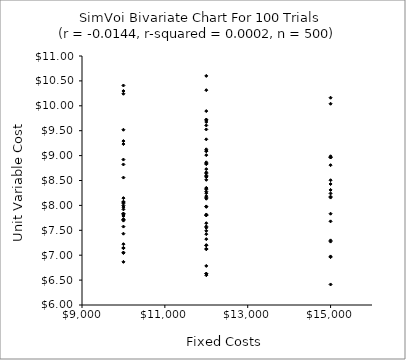
| Category | Series 0 |
|---|---|
| 12000.0 | 8.58 |
| 12000.0 | 8.323 |
| 12000.0 | 7.201 |
| 10000.0 | 7.811 |
| 12000.0 | 9.126 |
| 15000.0 | 6.412 |
| 10000.0 | 7.719 |
| 10000.0 | 8.559 |
| 10000.0 | 7.719 |
| 12000.0 | 8.134 |
| 12000.0 | 8.278 |
| 12000.0 | 8.843 |
| 12000.0 | 7.818 |
| 15000.0 | 8.176 |
| 12000.0 | 7.422 |
| 15000.0 | 6.961 |
| 10000.0 | 7.831 |
| 12000.0 | 9.713 |
| 12000.0 | 9.01 |
| 15000.0 | 8.429 |
| 12000.0 | 7.801 |
| 10000.0 | 8.075 |
| 10000.0 | 9.519 |
| 12000.0 | 7.97 |
| 15000.0 | 7.273 |
| 12000.0 | 7.489 |
| 12000.0 | 6.625 |
| 12000.0 | 7.129 |
| 12000.0 | 8.866 |
| 12000.0 | 9.525 |
| 10000.0 | 7.147 |
| 12000.0 | 9.606 |
| 10000.0 | 10.241 |
| 15000.0 | 10.162 |
| 15000.0 | 8.986 |
| 10000.0 | 10.408 |
| 12000.0 | 7.801 |
| 12000.0 | 6.784 |
| 12000.0 | 10.6 |
| 12000.0 | 8.643 |
| 15000.0 | 8.808 |
| 12000.0 | 8.6 |
| 15000.0 | 6.975 |
| 12000.0 | 9.087 |
| 12000.0 | 7.578 |
| 12000.0 | 7.551 |
| 10000.0 | 7.837 |
| 12000.0 | 9.327 |
| 10000.0 | 7.575 |
| 12000.0 | 7.322 |
| 10000.0 | 8.822 |
| 15000.0 | 7.833 |
| 12000.0 | 9.675 |
| 12000.0 | 8.156 |
| 15000.0 | 8.157 |
| 10000.0 | 9.292 |
| 12000.0 | 9.894 |
| 12000.0 | 8.664 |
| 12000.0 | 8.57 |
| 10000.0 | 7.432 |
| 15000.0 | 10.041 |
| 10000.0 | 7.221 |
| 15000.0 | 8.505 |
| 10000.0 | 7.054 |
| 12000.0 | 8.348 |
| 15000.0 | 7.298 |
| 12000.0 | 8.246 |
| 15000.0 | 8.31 |
| 10000.0 | 7.966 |
| 15000.0 | 8.24 |
| 10000.0 | 7.999 |
| 10000.0 | 6.866 |
| 10000.0 | 8.043 |
| 10000.0 | 7.141 |
| 12000.0 | 9.725 |
| 10000.0 | 10.297 |
| 12000.0 | 8.514 |
| 10000.0 | 9.232 |
| 12000.0 | 7.98 |
| 12000.0 | 7.642 |
| 15000.0 | 8.962 |
| 10000.0 | 7.044 |
| 12000.0 | 6.598 |
| 10000.0 | 7.921 |
| 15000.0 | 7.68 |
| 12000.0 | 7.197 |
| 12000.0 | 6.631 |
| 12000.0 | 8.348 |
| 12000.0 | 8.827 |
| 10000.0 | 7.694 |
| 10000.0 | 8.92 |
| 12000.0 | 8.187 |
| 10000.0 | 8.146 |
| 12000.0 | 9.093 |
| 15000.0 | 8.963 |
| 12000.0 | 7.119 |
| 10000.0 | 7.788 |
| 12000.0 | 8.729 |
| 12000.0 | 10.314 |
| 10000.0 | 8.063 |